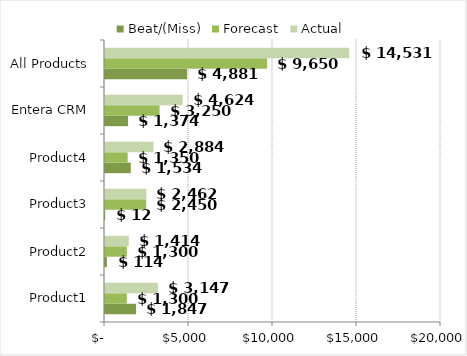
| Category | Beat/(Miss) | Forecast | Actual |
|---|---|---|---|
| Product1 | 1847 | 1300 | 3147 |
| Product2 | 114 | 1300 | 1414 |
| Product3 | 12 | 2450 | 2462 |
| Product4 | 1534 | 1350 | 2884 |
| Entera CRM | 1374 | 3250 | 4624 |
| All Products | 4881 | 9650 | 14531 |